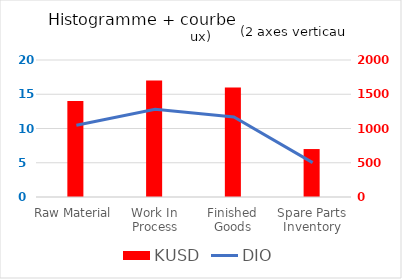
| Category | KUSD |
|---|---|
| Raw Material | 1400 |
| Work In Process | 1700 |
| Finished Goods | 1600 |
| Spare Parts Inventory | 700 |